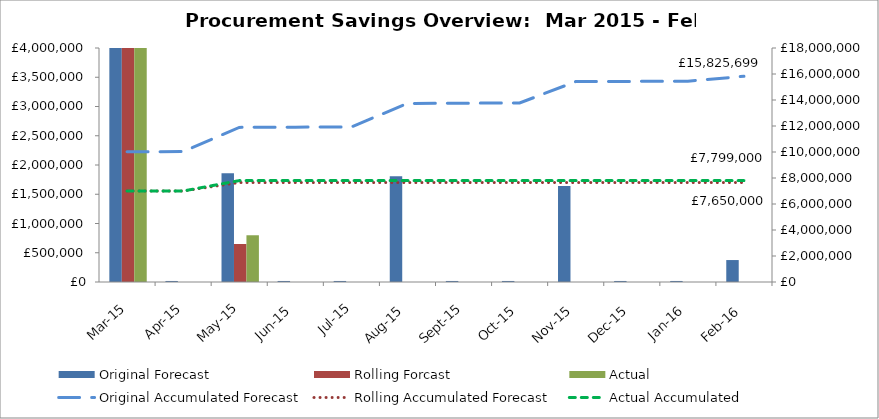
| Category | Original Forecast | Rolling Forcast | Actual |
|---|---|---|---|
| 2015-03-01 | 10017641.65 | 7000000 | 7000000 |
| 2015-04-01 | 17641.65 | 0 | 0 |
| 2015-05-01 | 1858599.64 | 650000 | 799000 |
| 2015-06-01 | 17641.65 | 0 | 0 |
| 2015-07-01 | 17641.65 | 0 | 0 |
| 2015-08-01 | 1807599.64 | 0 | 0 |
| 2015-09-01 | 17641.65 | 0 | 0 |
| 2015-10-01 | 17641.65 | 0 | 0 |
| 2015-11-01 | 1643099.64 | 0 | 0 |
| 2015-12-01 | 17641.65 | 0 | 0 |
| 2016-01-01 | 17641.65 | 0 | 0 |
| 2016-02-01 | 375266.65 | 0 | 0 |